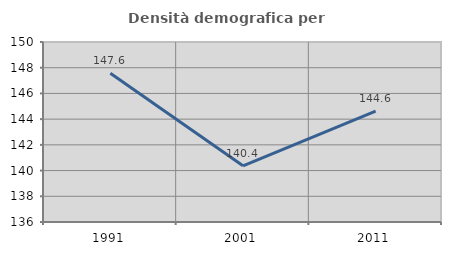
| Category | Densità demografica |
|---|---|
| 1991.0 | 147.571 |
| 2001.0 | 140.373 |
| 2011.0 | 144.626 |